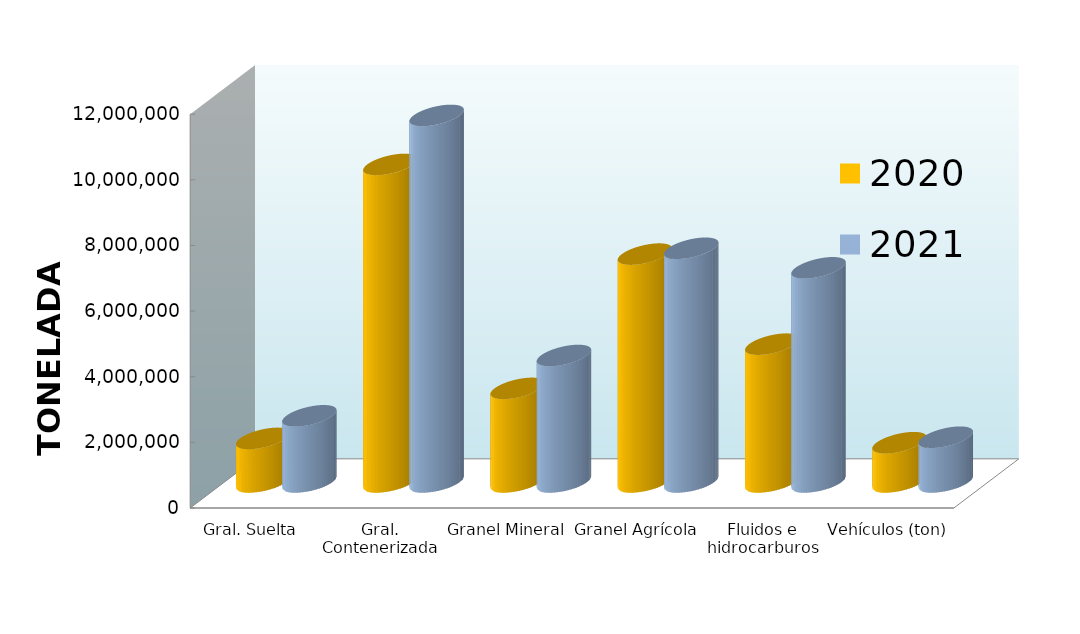
| Category | 2020 | 2021 |
|---|---|---|
| Gral. Suelta | 1328710.408 | 2017058.991 |
| Gral. Contenerizada | 9676551.997 | 11169814.146 |
| Granel Mineral | 2852640.457 | 3855202.08 |
| Granel Agrícola | 6943665.762 | 7121727.923 |
| Fluidos e hidrocarburos | 4200187.308 | 6526517.335 |
| Vehículos (ton) | 1197549.009 | 1364923.138 |